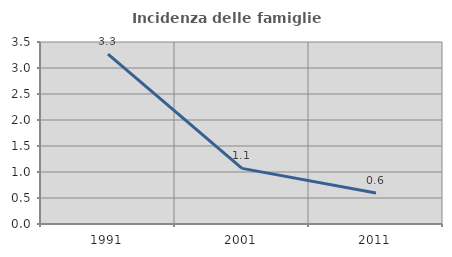
| Category | Incidenza delle famiglie numerose |
|---|---|
| 1991.0 | 3.268 |
| 2001.0 | 1.07 |
| 2011.0 | 0.595 |